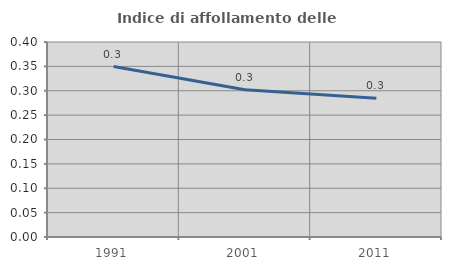
| Category | Indice di affollamento delle abitazioni  |
|---|---|
| 1991.0 | 0.35 |
| 2001.0 | 0.302 |
| 2011.0 | 0.285 |